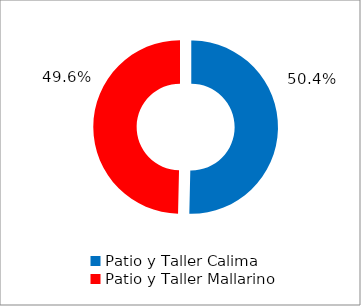
| Category | Series 0 |
|---|---|
| Patio y Taller Calima | 0.504 |
| Patio y Taller Mallarino | 0.496 |